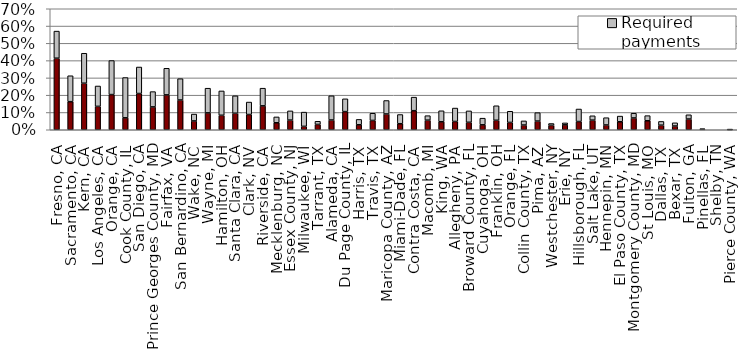
| Category | Current payments | Required payments |
|---|---|---|
| Fresno, CA | 0.414 | 0.157 |
| Sacramento, CA | 0.162 | 0.15 |
| Kern, CA | 0.269 | 0.173 |
| Los Angeles, CA | 0.135 | 0.118 |
| Orange, CA | 0.204 | 0.197 |
| Cook County, IL | 0.069 | 0.233 |
| San Diego, CA | 0.21 | 0.153 |
| Prince Georges County, MD | 0.132 | 0.089 |
| Fairfax, VA | 0.202 | 0.154 |
| San Bernardino, CA | 0.172 | 0.123 |
| Wake, NC | 0.051 | 0.04 |
| Wayne, MI | 0.098 | 0.143 |
| Hamilton, OH | 0.084 | 0.141 |
| Santa Clara, CA | 0.096 | 0.101 |
| Clark, NV | 0.088 | 0.072 |
| Riverside, CA | 0.138 | 0.102 |
| Mecklenburg, NC | 0.04 | 0.034 |
| Essex County, NJ | 0.056 | 0.053 |
| Milwaukee, WI | 0.02 | 0.082 |
| Tarrant, TX | 0.031 | 0.018 |
| Alameda, CA | 0.056 | 0.14 |
| Du Page County, IL | 0.105 | 0.074 |
| Harris, TX | 0.029 | 0.031 |
| Travis, TX | 0.054 | 0.042 |
| Maricopa County, AZ | 0.091 | 0.078 |
| Miami-Dade, FL | 0.035 | 0.053 |
| Contra Costa, CA | 0.11 | 0.078 |
| Macomb, MI | 0.055 | 0.026 |
| King, WA | 0.046 | 0.064 |
| Allegheny, PA | 0.048 | 0.078 |
| Broward County, FL | 0.043 | 0.066 |
| Cuyahoga, OH | 0.029 | 0.038 |
| Franklin, OH | 0.055 | 0.084 |
| Orange, FL | 0.042 | 0.065 |
| Collin County, TX | 0.027 | 0.024 |
| Pima, AZ | 0.05 | 0.049 |
| Westchester, NY | 0.025 | 0.011 |
| Erie, NY | 0.028 | 0.011 |
| Hillsborough, FL | 0.048 | 0.072 |
| Salt Lake, UT | 0.056 | 0.025 |
| Hennepin, MN | 0.028 | 0.042 |
| El Paso County, TX | 0.046 | 0.033 |
| Montgomery County, MD | 0.068 | 0.027 |
| St Louis, MO | 0.052 | 0.03 |
| Dallas, TX | 0.026 | 0.022 |
| Bexar, TX | 0.022 | 0.018 |
| Fulton, GA | 0.062 | 0.025 |
| Pinellas, FL | 0.002 | 0.003 |
| Shelby, TN | 0 | 0 |
| Pierce County, WA | 0.001 | 0.001 |